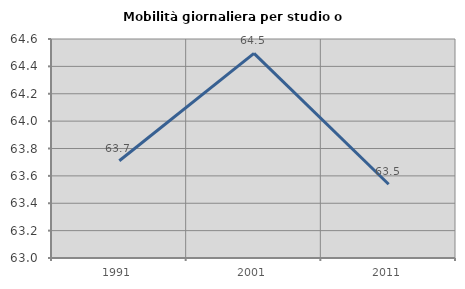
| Category | Mobilità giornaliera per studio o lavoro |
|---|---|
| 1991.0 | 63.71 |
| 2001.0 | 64.495 |
| 2011.0 | 63.539 |